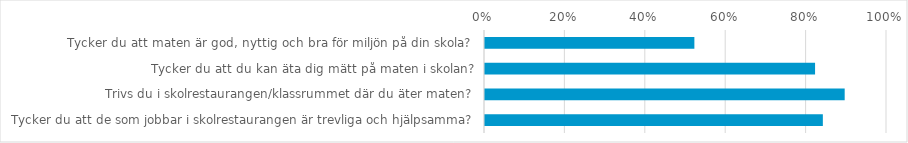
| Category | (Alla) |
|---|---|
| Tycker du att maten är god, nyttig och bra för miljön på din skola?  | 0.521 |
| Tycker du att du kan äta dig mätt på maten i skolan? | 0.821 |
| Trivs du i skolrestaurangen/klassrummet där du äter maten? | 0.895 |
| Tycker du att de som jobbar i skolrestaurangen är trevliga och hjälpsamma? | 0.84 |